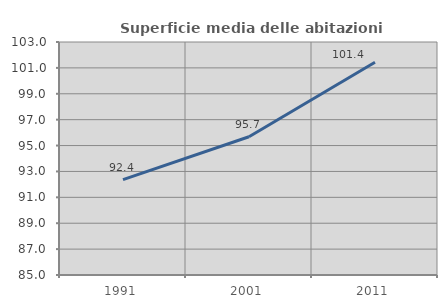
| Category | Superficie media delle abitazioni occupate |
|---|---|
| 1991.0 | 92.362 |
| 2001.0 | 95.681 |
| 2011.0 | 101.435 |